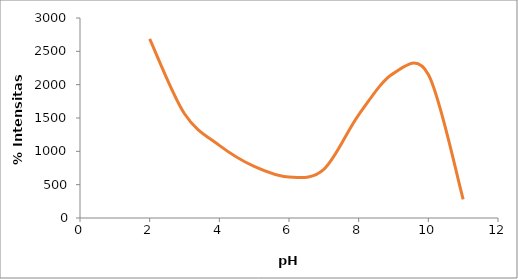
| Category | %CI |
|---|---|
| 2.0 | 2687.5 |
| 3.0 | 1563.38 |
| 4.0 | 1089.286 |
| 5.0 | 773.684 |
| 6.0 | 614.907 |
| 7.0 | 730.159 |
| 8.0 | 1547.059 |
| 9.0 | 2168.919 |
| 10.0 | 2152.778 |
| 11.0 | 278.947 |